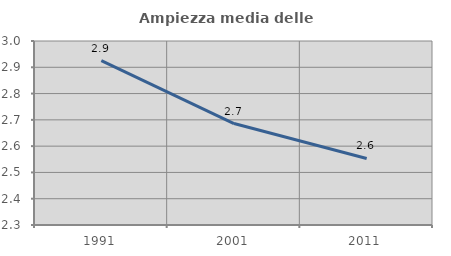
| Category | Ampiezza media delle famiglie |
|---|---|
| 1991.0 | 2.926 |
| 2001.0 | 2.686 |
| 2011.0 | 2.553 |